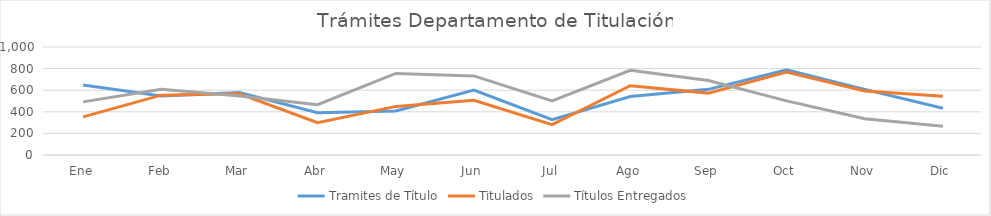
| Category | Tramites de Título | Titulados | Títulos Entregados |
|---|---|---|---|
| Ene | 648 | 353 | 492 |
| Feb | 547 | 554 | 609 |
| Mar | 578 | 567 | 547 |
| Abr | 391 | 300 | 466 |
| May | 407 | 450 | 755 |
| Jun | 602 | 506 | 732 |
| Jul | 327 | 281 | 501 |
| Ago | 542 | 642 | 784 |
| Sep | 608 | 573 | 690 |
| Oct | 789 | 768 | 501 |
| Nov | 608 | 592 | 335 |
| Dic | 433 | 545 | 266 |